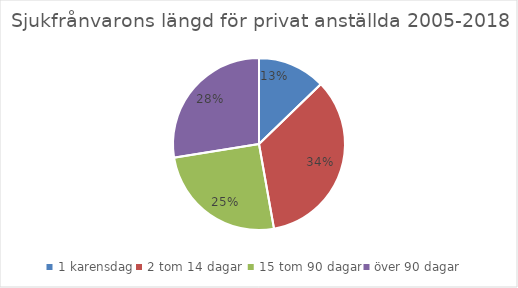
| Category | Series 0 |
|---|---|
| 1 karensdag | 0.128 |
| 2 tom 14 dagar  | 0.345 |
| 15 tom 90 dagar | 0.252 |
| över 90 dagar | 0.275 |